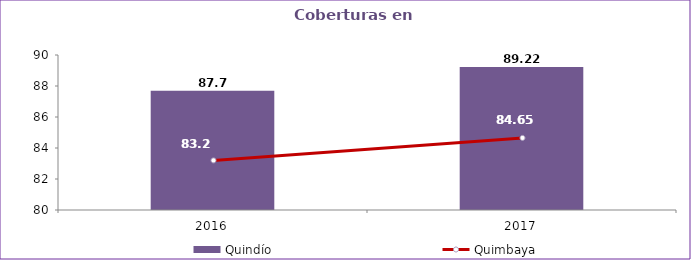
| Category | Quindío |
|---|---|
| 2016.0 | 87.7 |
| 2017.0 | 89.22 |